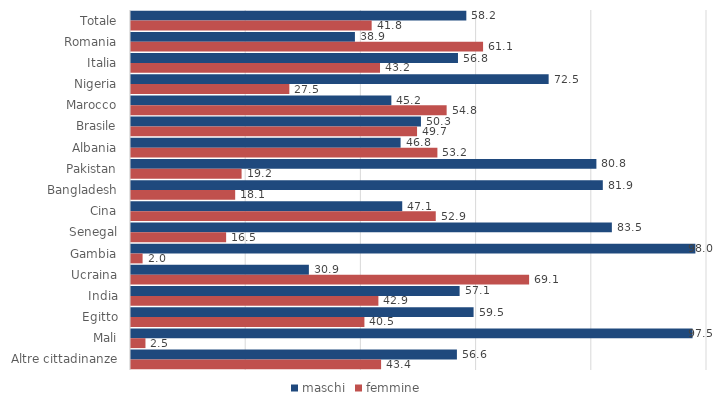
| Category | maschi | femmine |
|---|---|---|
| Totale | 58.217 | 41.783 |
| Romania | 38.875 | 61.125 |
| Italia | 56.768 | 43.232 |
| Nigeria | 72.508 | 27.492 |
| Marocco | 45.201 | 54.799 |
| Brasile | 50.338 | 49.662 |
| Albania | 46.805 | 53.195 |
| Pakistan | 80.799 | 19.201 |
| Bangladesh | 81.912 | 18.088 |
| Cina | 47.09 | 52.91 |
| Senegal | 83.484 | 16.516 |
| Gambia | 97.986 | 2.014 |
| Ucraina | 30.883 | 69.117 |
| India | 57.05 | 42.95 |
| Egitto | 59.476 | 40.524 |
| Mali | 97.489 | 2.511 |
| Altre cittadinanze | 56.582 | 43.418 |